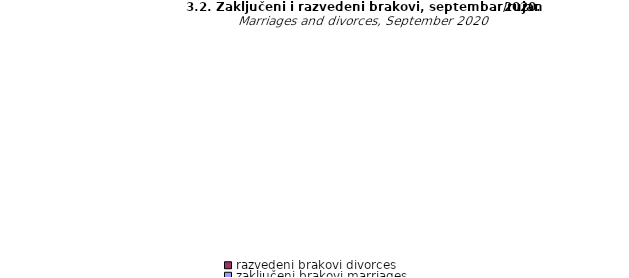
| Category | zaključeni brakovi marriages | razvedeni brakovi divorces |
|---|---|---|
| Unsko - sanski | 123 | 23 |
| Kanton Posavski | 5 | 1 |
| Tuzlanski | 214 | 28 |
| Zeničko - dobojski | 205 | 18 |
| Bosansko - podrinjski | 20 | 3 |
| Srednjobosanski | 113 | 6 |
| Hercegovačko-
neretvanski | 107 | 4 |
| Zapadnohercegovački | 40 | 2 |
| Kanton Sarajevo | 273 | 1 |
| Kanton 10 | 16 | 0 |